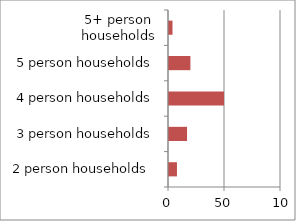
| Category | Series 0 | Series 1 |
|---|---|---|
| 2 person households  |  | 8 |
| 3 person households |  | 17 |
| 4 person households |  | 50 |
| 5 person households |  | 20 |
| 5+ person households |  | 4 |